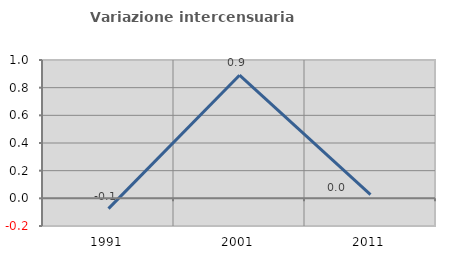
| Category | Variazione intercensuaria annua |
|---|---|
| 1991.0 | -0.074 |
| 2001.0 | 0.89 |
| 2011.0 | 0.027 |